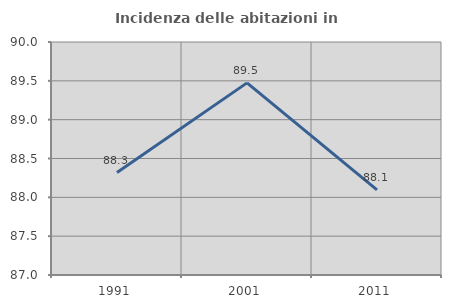
| Category | Incidenza delle abitazioni in proprietà  |
|---|---|
| 1991.0 | 88.32 |
| 2001.0 | 89.474 |
| 2011.0 | 88.095 |